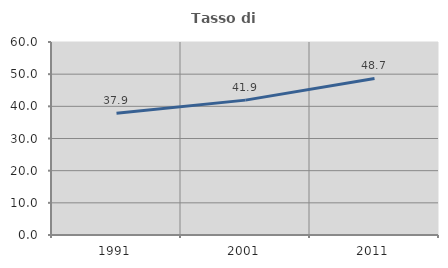
| Category | Tasso di occupazione   |
|---|---|
| 1991.0 | 37.864 |
| 2001.0 | 41.928 |
| 2011.0 | 48.676 |